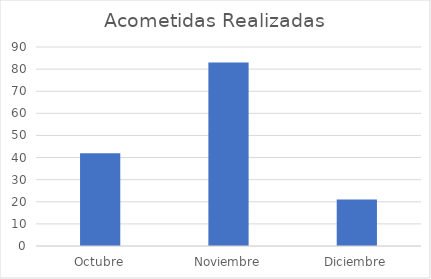
| Category | Acometidas Realizadas |
|---|---|
| Octubre | 42 |
| Noviembre | 83 |
| Diciembre | 21 |